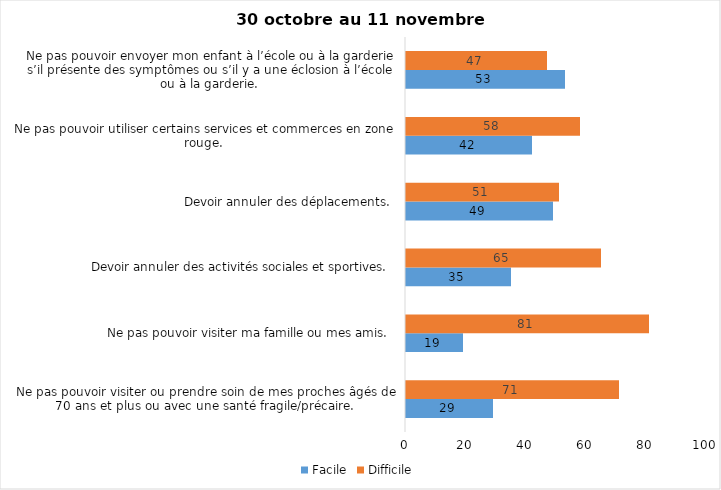
| Category | Facile | Difficile |
|---|---|---|
| Ne pas pouvoir visiter ou prendre soin de mes proches âgés de 70 ans et plus ou avec une santé fragile/précaire.  | 29 | 71 |
| Ne pas pouvoir visiter ma famille ou mes amis.  | 19 | 81 |
| Devoir annuler des activités sociales et sportives.  | 35 | 65 |
| Devoir annuler des déplacements.  | 49 | 51 |
| Ne pas pouvoir utiliser certains services et commerces en zone rouge.  | 42 | 58 |
| Ne pas pouvoir envoyer mon enfant à l’école ou à la garderie s’il présente des symptômes ou s’il y a une éclosion à l’école ou à la garderie.  | 53 | 47 |